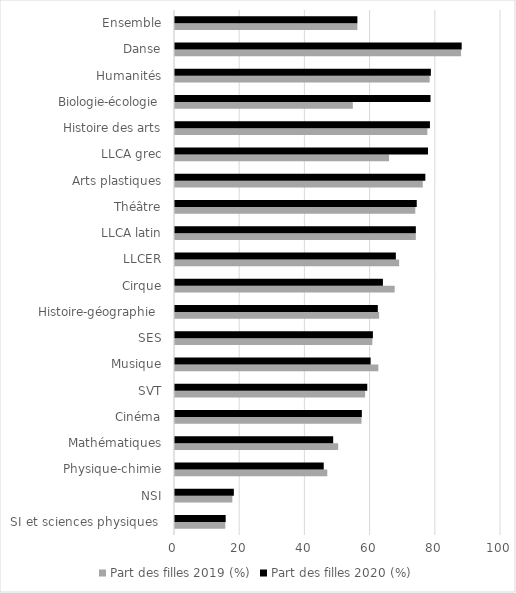
| Category | Part des filles 2019 (%) | Part des filles 2020 (%) |
|---|---|---|
| SI et sciences physiques  | 15.429 | 15.545 |
| NSI | 17.586 | 18.05 |
| Physique-chimie | 46.715 | 45.621 |
| Mathématiques | 50.054 | 48.521 |
| Cinéma | 57.218 | 57.305 |
| SVT | 58.317 | 58.975 |
| Musique | 62.378 | 60.011 |
| SES | 60.534 | 60.703 |
| Histoire-géographie  | 62.609 | 62.215 |
| Cirque | 67.391 | 63.78 |
| LLCER | 68.754 | 67.746 |
| LLCA latin | 73.867 | 73.878 |
| Théâtre | 73.707 | 74.156 |
| Arts plastiques | 76.008 | 76.789 |
| LLCA grec | 65.646 | 77.6 |
| Histoire des arts | 77.411 | 78.2 |
| Biologie-écologie | 54.545 | 78.378 |
| Humanités | 78.123 | 78.486 |
| Danse | 87.743 | 87.937 |
| Ensemble | 55.948 | 55.948 |